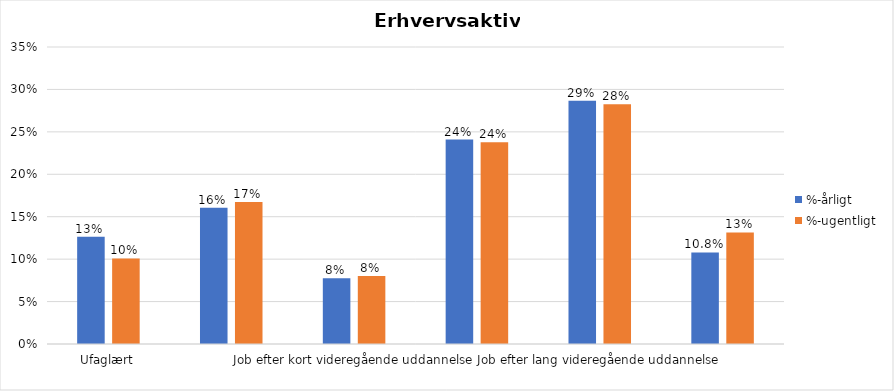
| Category | %-årligt | %-ugentligt |
|---|---|---|
| Ufaglært | 0.126 | 0.101 |
| Erhvervsfagligt job | 0.161 | 0.167 |
| Job efter kort videregående uddannelse | 0.078 | 0.08 |
| Job efter mellemlang videregående uddannelse | 0.241 | 0.238 |
| Job efter lang videregående uddannelse | 0.287 | 0.283 |
| Selvstændig | 0.108 | 0.131 |